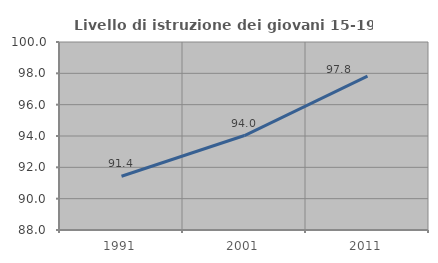
| Category | Livello di istruzione dei giovani 15-19 anni |
|---|---|
| 1991.0 | 91.429 |
| 2001.0 | 94.03 |
| 2011.0 | 97.826 |